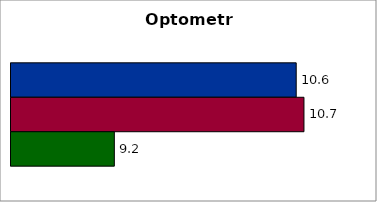
| Category | 50 states and D.C. | SREB states | State |
|---|---|---|---|
| 0 | 10.637 | 10.698 | 9.211 |